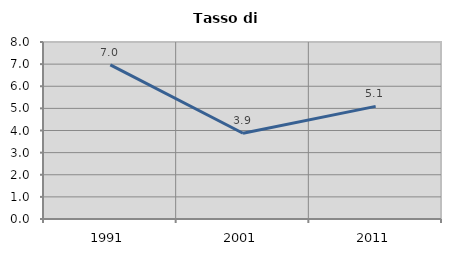
| Category | Tasso di disoccupazione   |
|---|---|
| 1991.0 | 6.966 |
| 2001.0 | 3.875 |
| 2011.0 | 5.09 |